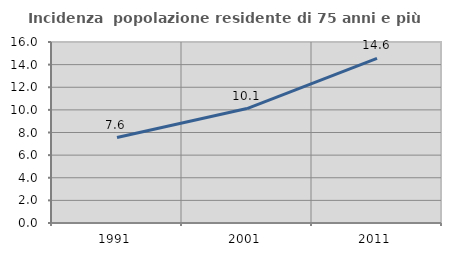
| Category | Incidenza  popolazione residente di 75 anni e più |
|---|---|
| 1991.0 | 7.551 |
| 2001.0 | 10.119 |
| 2011.0 | 14.556 |